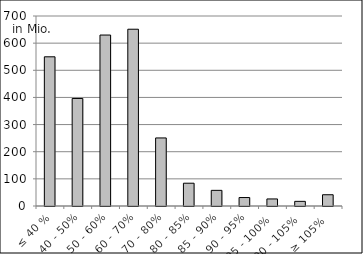
| Category | Volumen |
|---|---|
| ≤ 40 % | 549681239.271 |
| 40 - 50% | 396133747.856 |
| 50 - 60% | 629848065.823 |
| 60 - 70% | 651265315.957 |
| 70 - 80% | 250724075.273 |
| 80 - 85% | 83974548.973 |
| 85 - 90% | 57649421.809 |
| 90 - 95% | 31162125.471 |
| 95 - 100% | 25986063.573 |
| 100 - 105% | 17148383.745 |
| ≥ 105% | 41482737.323 |